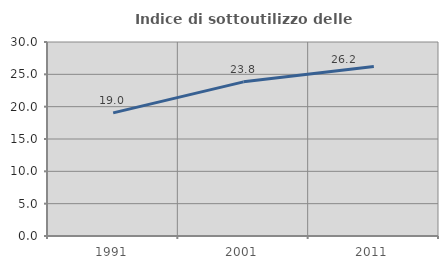
| Category | Indice di sottoutilizzo delle abitazioni  |
|---|---|
| 1991.0 | 19.035 |
| 2001.0 | 23.84 |
| 2011.0 | 26.226 |